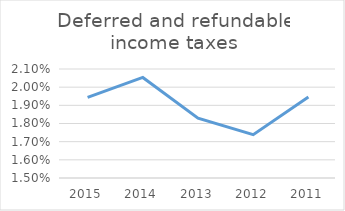
| Category | Deferred and refundable income taxes |
|---|---|
| 2015.0 | 0.019 |
| 2014.0 | 0.021 |
| 2013.0 | 0.018 |
| 2012.0 | 0.017 |
| 2011.0 | 0.019 |